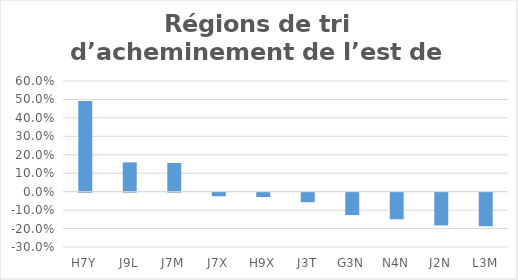
| Category | Series 0 |
|---|---|
| H7Y | 0.492 |
| J9L | 0.159 |
| J7M | 0.155 |
| J7X | -0.02 |
| H9X | -0.024 |
| J3T | -0.052 |
| G3N | -0.122 |
| N4N | -0.144 |
| J2N | -0.178 |
| L3M | -0.182 |